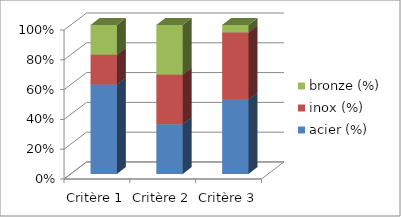
| Category | acier (%) | inox (%) | bronze (%) |
|---|---|---|---|
| Critère 1 | 60 | 20 | 20 |
| Critère 2 | 33 | 33 | 33 |
| Critère 3 | 50 | 45 | 5 |